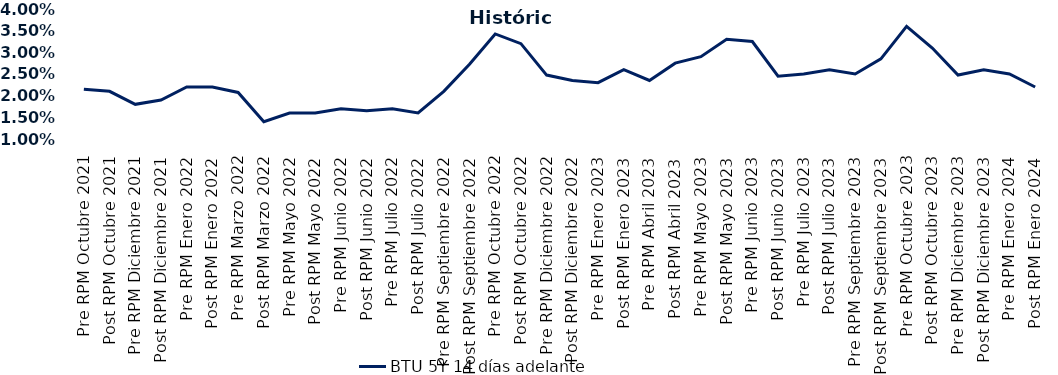
| Category | BTU 5Y 14 días adelante |
|---|---|
| Pre RPM Octubre 2021 | 0.022 |
| Post RPM Octubre 2021 | 0.021 |
| Pre RPM Diciembre 2021 | 0.018 |
| Post RPM Diciembre 2021 | 0.019 |
| Pre RPM Enero 2022 | 0.022 |
| Post RPM Enero 2022 | 0.022 |
| Pre RPM Marzo 2022 | 0.021 |
| Post RPM Marzo 2022 | 0.014 |
| Pre RPM Mayo 2022 | 0.016 |
| Post RPM Mayo 2022 | 0.016 |
| Pre RPM Junio 2022 | 0.017 |
| Post RPM Junio 2022 | 0.016 |
| Pre RPM Julio 2022 | 0.017 |
| Post RPM Julio 2022 | 0.016 |
| Pre RPM Septiembre 2022 | 0.021 |
| Post RPM Septiembre 2022 | 0.027 |
| Pre RPM Octubre 2022 | 0.034 |
| Post RPM Octubre 2022 | 0.032 |
| Pre RPM Diciembre 2022 | 0.025 |
| Post RPM Diciembre 2022 | 0.024 |
| Pre RPM Enero 2023 | 0.023 |
| Post RPM Enero 2023 | 0.026 |
| Pre RPM Abril 2023 | 0.024 |
| Post RPM Abril 2023 | 0.028 |
| Pre RPM Mayo 2023 | 0.029 |
| Post RPM Mayo 2023 | 0.033 |
| Pre RPM Junio 2023 | 0.032 |
| Post RPM Junio 2023 | 0.024 |
| Pre RPM Julio 2023 | 0.025 |
| Post RPM Julio 2023 | 0.026 |
| Pre RPM Septiembre 2023 | 0.025 |
| Post RPM Septiembre 2023 | 0.028 |
| Pre RPM Octubre 2023 | 0.036 |
| Post RPM Octubre 2023 | 0.031 |
| Pre RPM Diciembre 2023 | 0.025 |
| Post RPM Diciembre 2023 | 0.026 |
| Pre RPM Enero 2024 | 0.025 |
| Post RPM Enero 2024 | 0.022 |